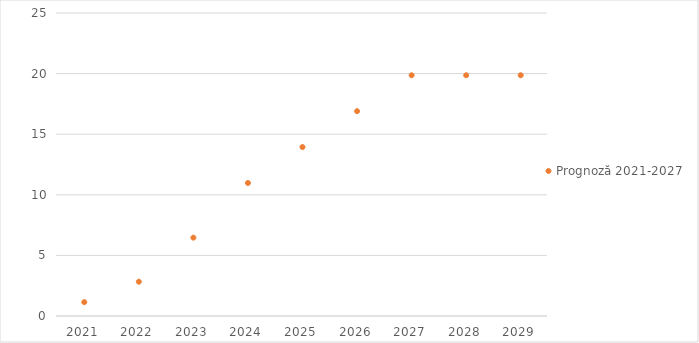
| Category | Prognoză 2021-2027 |
|---|---|
| 2021.0 | 1.145 |
| 2022.0 | 2.828 |
| 2023.0 | 6.464 |
| 2024.0 | 10.976 |
| 2025.0 | 13.938 |
| 2026.0 | 16.901 |
| 2027.0 | 19.864 |
| 2028.0 | 19.864 |
| 2029.0 | 19.864 |